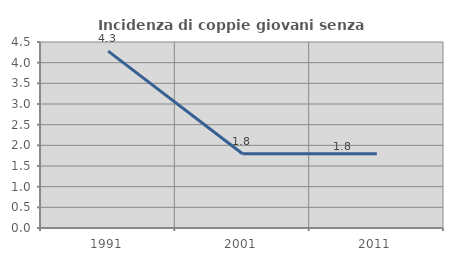
| Category | Incidenza di coppie giovani senza figli |
|---|---|
| 1991.0 | 4.279 |
| 2001.0 | 1.796 |
| 2011.0 | 1.795 |